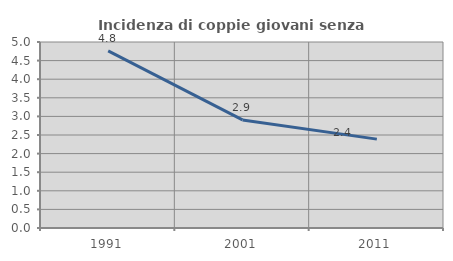
| Category | Incidenza di coppie giovani senza figli |
|---|---|
| 1991.0 | 4.762 |
| 2001.0 | 2.906 |
| 2011.0 | 2.389 |